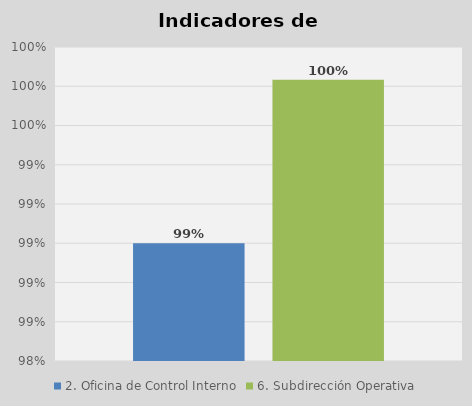
| Category | 2. Oficina de Control Interno | 6. Subdirección Operativa |
|---|---|---|
| 0 | 0.99 | 0.998 |